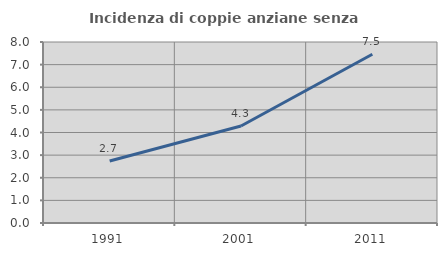
| Category | Incidenza di coppie anziane senza figli  |
|---|---|
| 1991.0 | 2.738 |
| 2001.0 | 4.288 |
| 2011.0 | 7.457 |